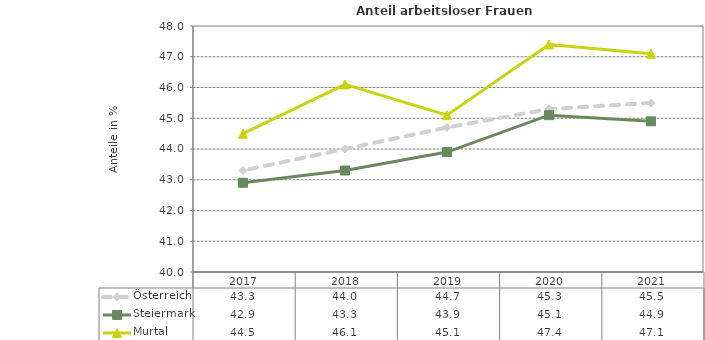
| Category | Österreich | Steiermark | Murtal |
|---|---|---|---|
| 2021.0 | 45.5 | 44.9 | 47.1 |
| 2020.0 | 45.3 | 45.1 | 47.4 |
| 2019.0 | 44.7 | 43.9 | 45.1 |
| 2018.0 | 44 | 43.3 | 46.1 |
| 2017.0 | 43.3 | 42.9 | 44.5 |